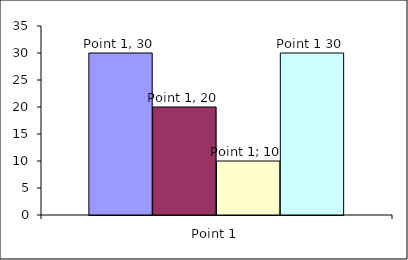
| Category | Series 1 | Series 2 | Series 3 | Series 4 |
|---|---|---|---|---|
| Point 1 | 30 | 20 | 10 | 30 |